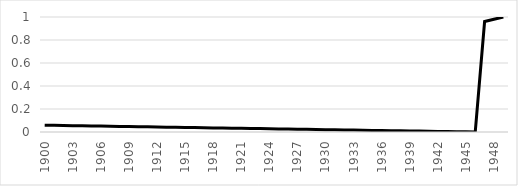
| Category | zt |
|---|---|
| 1900-01-01 | 0.059 |
| 1901-01-01 | 0.058 |
| 1902-01-01 | 0.056 |
| 1903-01-01 | 0.055 |
| 1904-01-01 | 0.054 |
| 1905-01-01 | 0.052 |
| 1906-01-01 | 0.051 |
| 1907-01-01 | 0.05 |
| 1908-01-01 | 0.049 |
| 1909-01-01 | 0.047 |
| 1910-01-01 | 0.046 |
| 1911-01-01 | 0.045 |
| 1912-01-01 | 0.044 |
| 1913-01-01 | 0.042 |
| 1914-01-01 | 0.041 |
| 1915-01-01 | 0.04 |
| 1916-01-01 | 0.038 |
| 1917-01-01 | 0.037 |
| 1918-01-01 | 0.036 |
| 1919-01-01 | 0.035 |
| 1920-01-01 | 0.033 |
| 1921-01-01 | 0.032 |
| 1922-01-01 | 0.031 |
| 1923-01-01 | 0.029 |
| 1924-01-01 | 0.028 |
| 1925-01-01 | 0.027 |
| 1926-01-01 | 0.026 |
| 1927-01-01 | 0.024 |
| 1928-01-01 | 0.023 |
| 1929-01-01 | 0.022 |
| 1930-01-01 | 0.02 |
| 1931-01-01 | 0.019 |
| 1932-01-01 | 0.018 |
| 1933-01-01 | 0.017 |
| 1934-01-01 | 0.015 |
| 1935-01-01 | 0.014 |
| 1936-01-01 | 0.013 |
| 1937-01-01 | 0.012 |
| 1938-01-01 | 0.01 |
| 1939-01-01 | 0.009 |
| 1940-01-01 | 0.008 |
| 1941-01-01 | 0.006 |
| 1942-01-01 | 0.005 |
| 1943-01-01 | 0.004 |
| 1944-01-01 | 0.003 |
| 1945-01-01 | 0.001 |
| 1946-01-01 | 0 |
| 1947-01-01 | 0.961 |
| 1948-01-01 | 0.98 |
| 1949-01-01 | 1 |